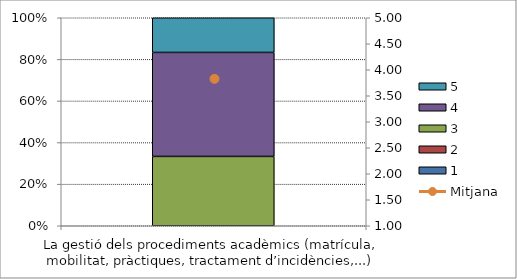
| Category | 1 | 2 | 3 | 4 | 5 |
|---|---|---|---|---|---|
| La gestió dels procediments acadèmics (matrícula, mobilitat, pràctiques, tractament d’incidències,...) | 0 | 0 | 2 | 3 | 1 |